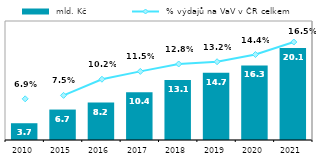
| Category |  mld. Kč |
|---|---|
| 2010.0 | 3.664 |
| 2015.0 | 6.651 |
| 2016.0 | 8.182 |
| 2017.0 | 10.424 |
| 2018.0 | 13.125 |
| 2019.0 | 14.683 |
| 2020.0 | 16.284 |
| 2021.0 | 20.078 |